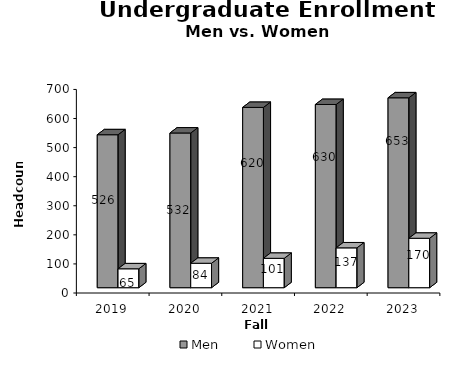
| Category | Men | Women |
|---|---|---|
| 2019.0 | 526 | 65 |
| 2020.0 | 532 | 84 |
| 2021.0 | 620 | 101 |
| 2022.0 | 630 | 137 |
| 2023.0 | 653 | 170 |